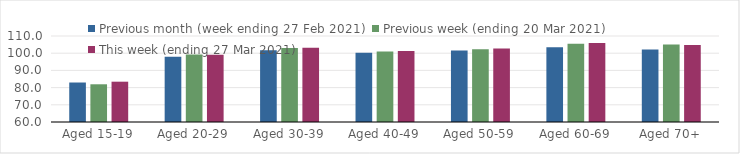
| Category | Previous month (week ending 27 Feb 2021) | Previous week (ending 20 Mar 2021) | This week (ending 27 Mar 2021) |
|---|---|---|---|
| Aged 15-19 | 82.96 | 81.93 | 83.44 |
| Aged 20-29 | 97.99 | 99.29 | 99.17 |
| Aged 30-39 | 101.68 | 103 | 103.1 |
| Aged 40-49 | 100.2 | 100.97 | 101.32 |
| Aged 50-59 | 101.59 | 102.34 | 102.78 |
| Aged 60-69 | 103.39 | 105.5 | 105.86 |
| Aged 70+ | 102.1 | 105.11 | 104.83 |